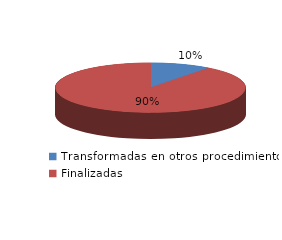
| Category | Series 0 |
|---|---|
| Transformadas en otros procedimientos | 3059 |
| Finalizadas | 26814 |